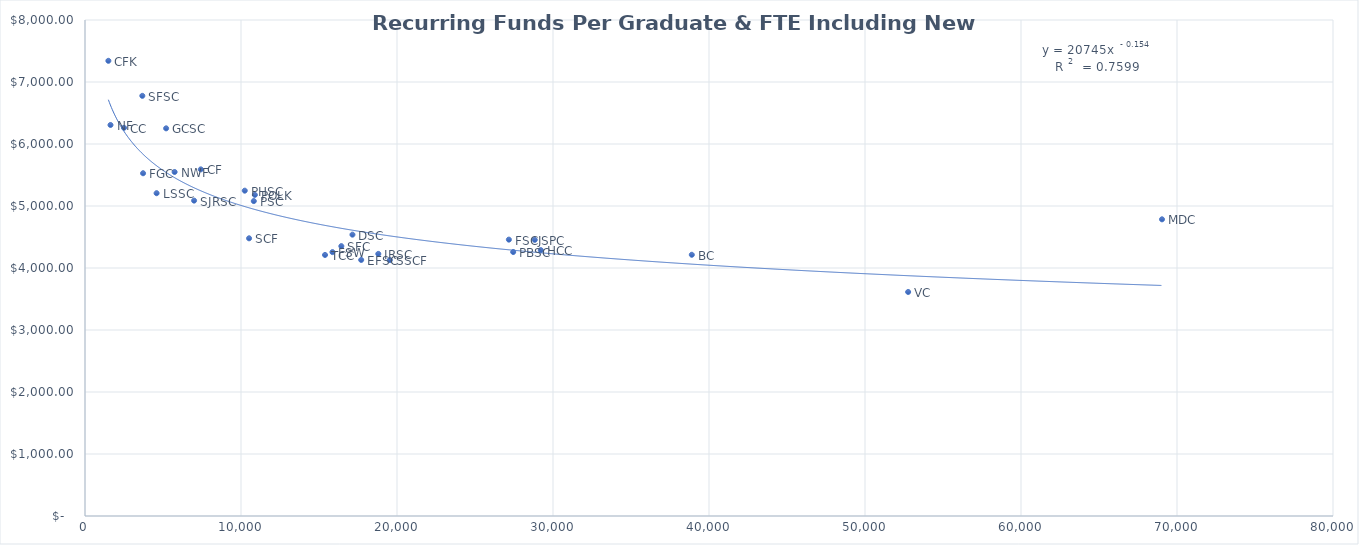
| Category |  Recurring Funds Per Graduate & FTE Including New Distributions |
|---|---|
| 1498.1 | 7341.483 |
| 1634.9 | 6306.634 |
| 2498.4 | 6260.773 |
| 3674.9 | 6776.654 |
| 3722.2 | 5528.149 |
| 4589.2 | 5206.317 |
| 5200.0 | 6252.624 |
| 5743.9 | 5548.517 |
| 6992.3 | 5086.609 |
| 7422.1 | 5590.587 |
| 10240.3 | 5247.172 |
| 10517.3 | 4478.803 |
| 10820.3 | 5079.316 |
| 10887.6 | 5179.12 |
| 15385.7 | 4210.31 |
| 15863.5 | 4256.299 |
| 16431.9 | 4352.592 |
| 17144.7 | 4537.755 |
| 17705.3 | 4129.868 |
| 18802.0 | 4227.436 |
| 19540.9 | 4128.177 |
| 27449.1 | 4257.64 |
| 27171.4 | 4457.489 |
| 28829.3 | 4453.822 |
| 29217.5 | 4287.766 |
| 38897.8 | 4213.115 |
| 52766.4 | 3613.135 |
| 69038.8 | 4784.979 |